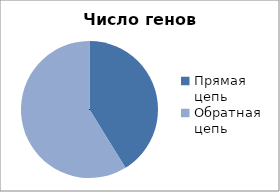
| Category | Series 0 |
|---|---|
| Прямая цепь  | 606 |
| Обратная цепь | 865 |